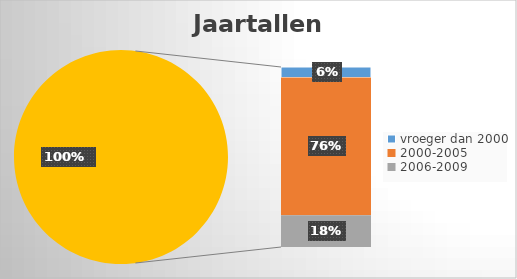
| Category | Series 0 |
|---|---|
| vroeger dan 2000 | 1 |
| 2000-2005 | 13 |
| 2006-2009 | 3 |